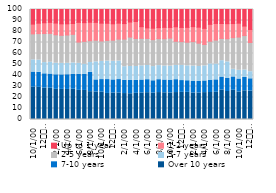
| Category | Over 10 years | 7-10 years | 5-7 years | 2-5 years | 1-2 years | Up to 1 year |
|---|---|---|---|---|---|---|
| 10 | 29.365 | 13.772 | 11.125 | 23.558 | 8.91 | 13.27 |
| 11 | 29.269 | 13.657 | 11.063 | 24.103 | 9.483 | 12.425 |
| 12
2013 | 28.5 | 13.031 | 10.219 | 26.395 | 9.8 | 12.057 |
| 1 | 28.411 | 12.903 | 10.734 | 26.243 | 9.997 | 11.7 |
| 2 | 27.409 | 13.233 | 10.525 | 25.874 | 10.64 | 12.318 |
| 3 | 27.388 | 13.191 | 10.438 | 25.506 | 10.452 | 13 |
| 4 | 27.34 | 13.362 | 10.37 | 25.731 | 10.176 | 13.021 |
| 5 | 27.525 | 13.433 | 10.486 | 25.976 | 9.852 | 12.729 |
| 6 | 26.505 | 14.623 | 9.903 | 19.351 | 17.926 | 11.692 |
| 7 | 26.427 | 14.579 | 9.201 | 20.813 | 17.014 | 11.966 |
| 8 | 25.3 | 17.6 | 8.9 | 19.8 | 16.8 | 11.552 |
| 9 | 25 | 11 | 16.4 | 19.7 | 16.2 | 11.709 |
| 10 | 24.9 | 11.4 | 16.5 | 18.6 | 16.2 | 12.364 |
| 11 | 23.7 | 12.6 | 16.8 | 18.8 | 15.6 | 12.51 |
| 12
2014 | 24.1 | 11.9 | 16.9 | 19.2 | 14.9 | 12.99 |
| 1 | 24.1 | 12.2 | 16.8 | 20 | 14.5 | 12.446 |
| 2 | 23.6 | 12.1 | 12.3 | 25.1 | 14.1 | 12.829 |
| 3 | 23.4 | 12.1 | 12.7 | 26.7 | 13.7 | 11.424 |
| 4 | 23.8 | 11.7 | 12.7 | 25.4 | 15.5 | 10.882 |
| 5 | 24.1 | 11.8 | 12.9 | 25 | 10.6 | 15.647 |
| 6 | 24.4 | 11.8 | 12.9 | 24.6 | 9.6 | 16.749 |
| 7 | 24 | 11.2 | 12.9 | 24.5 | 10.4 | 16.972 |
| 8 | 24.5 | 11.7 | 12.8 | 24.5 | 10 | 16.48 |
| 9 | 24.3 | 11.6 | 12.7 | 24.8 | 10.4 | 16.188 |
| 10 | 24.1 | 11.7 | 12.8 | 25.4 | 9.7 | 16.349 |
| 11 | 24.5 | 11.7 | 13 | 21.9 | 13.2 | 15.667 |
| 12
2015 | 24.7 | 10.7 | 13.8 | 21.6 | 12.9 | 16.261 |
| 1 | 24.679 | 10.567 | 13.528 | 21.484 | 13.523 | 16.219 |
| 2 | 24.1 | 10.426 | 14.059 | 22.209 | 13.634 | 15.573 |
| 3 | 24.059 | 10.538 | 13.611 | 21.172 | 14.574 | 16.046 |
| 4 | 24.446 | 10.611 | 13.688 | 19.479 | 14.658 | 17.118 |
| 5 | 24.563 | 11.215 | 14.76 | 20.606 | 15.382 | 13.474 |
| 6 | 24.744 | 11.292 | 14.387 | 21.797 | 15.098 | 12.681 |
| 7 | 26.845 | 11.747 | 14.882 | 20.22 | 13.563 | 12.743 |
| 8 | 25.444 | 11.824 | 15.111 | 21.036 | 13.684 | 12.901 |
| 9 | 26.589 | 12.124 | 6.949 | 28.753 | 12.811 | 12.773 |
| 10 | 25.051 | 11.764 | 7.935 | 30.184 | 12.639 | 12.427 |
| 11 | 26.106 | 12.116 | 6.824 | 31.255 | 8.662 | 15.037 |
| 12
2016 | 25.872 | 11.144 | 6.432 | 26.56 | 11.849 | 18.142 |